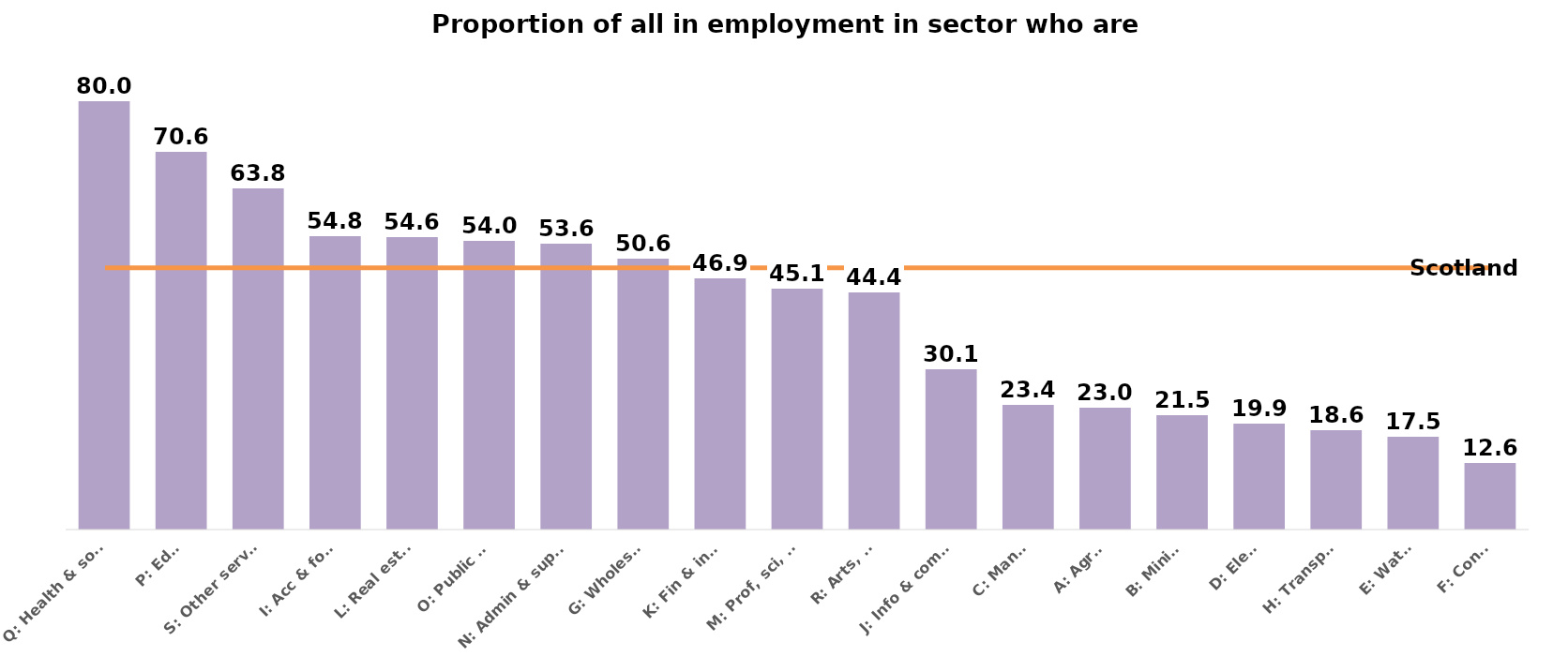
| Category | Series 0 |
|---|---|
| Q: Health & social | 80 |
| P: Educ | 70.648 |
| S: Other service | 63.782 |
| I: Acc & food | 54.814 |
| L: Real estate | 54.612 |
| O: Public ad | 54.044 |
| N: Admin & support | 53.554 |
| G: Wholesale | 50.597 |
| K: Fin & insur | 46.939 |
| M: Prof, sci, etc. | 45.115 |
| R: Arts, etc | 44.382 |
| J: Info & comms | 30.137 |
| C: Manuf | 23.448 |
| A: Agric | 22.973 |
| B: Mining | 21.549 |
| D: Elect | 19.877 |
| H: Transport | 18.648 |
| E: Water | 17.532 |
| F: Const | 12.555 |